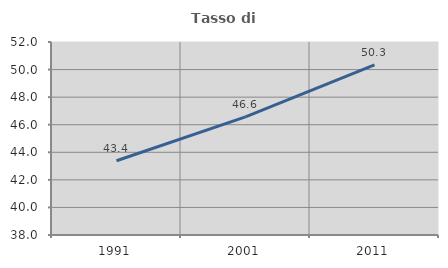
| Category | Tasso di occupazione   |
|---|---|
| 1991.0 | 43.383 |
| 2001.0 | 46.572 |
| 2011.0 | 50.348 |